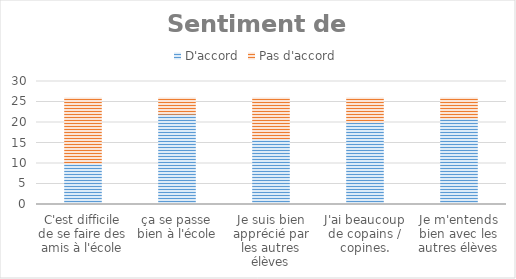
| Category | D'accord | Pas d'accord |
|---|---|---|
| C'est difficile de se faire des amis à l'école | 10 | 16 |
| ça se passe bien à l'école | 22 | 4 |
| Je suis bien apprécié par les autres élèves | 16 | 10 |
| J'ai beaucoup de copains / copines. | 20 | 6 |
| Je m'entends bien avec les autres élèves | 21 | 5 |